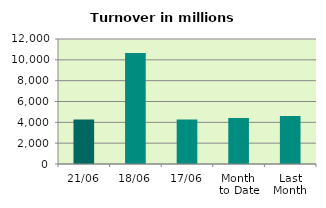
| Category | Series 0 |
|---|---|
| 21/06 | 4283.982 |
| 18/06 | 10658.123 |
| 17/06 | 4268.774 |
| Month 
to Date | 4419.82 |
| Last
Month | 4609.327 |